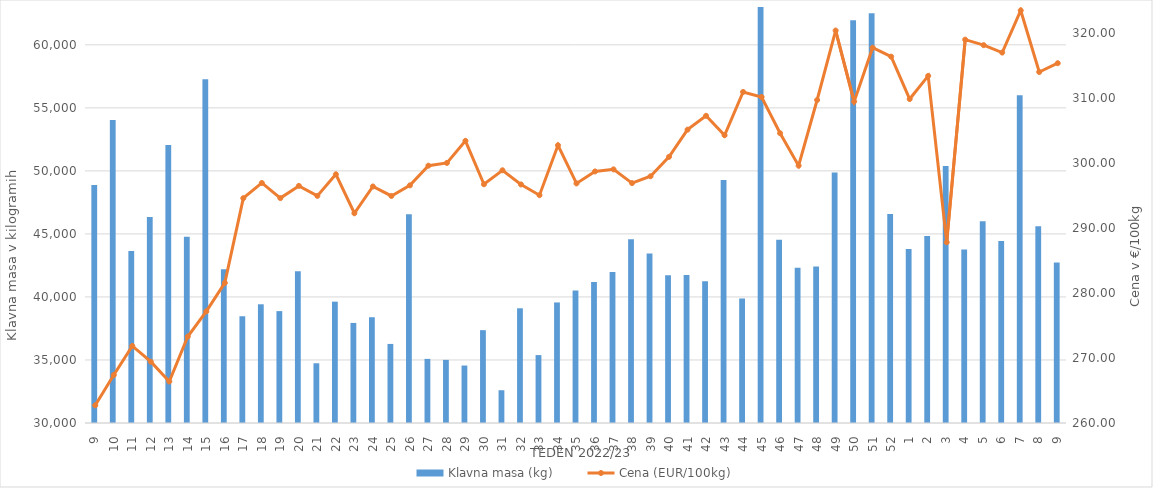
| Category | Klavna masa (kg) |
|---|---|
| 9.0 | 48872 |
| 10.0 | 54045 |
| 11.0 | 43645 |
| 12.0 | 46350 |
| 13.0 | 52061 |
| 14.0 | 44774 |
| 15.0 | 57268 |
| 16.0 | 42191 |
| 17.0 | 38469 |
| 18.0 | 39417 |
| 19.0 | 38876 |
| 20.0 | 42047 |
| 21.0 | 34739 |
| 22.0 | 39626 |
| 23.0 | 37939 |
| 24.0 | 38390 |
| 25.0 | 36272 |
| 26.0 | 46553 |
| 27.0 | 35085 |
| 28.0 | 35007 |
| 29.0 | 34559 |
| 30.0 | 37366 |
| 31.0 | 32599 |
| 32.0 | 39100 |
| 33.0 | 35388 |
| 34.0 | 39563 |
| 35.0 | 40507 |
| 36.0 | 41176 |
| 37.0 | 41983 |
| 38.0 | 44572 |
| 39.0 | 43447 |
| 40.0 | 41711 |
| 41.0 | 41736 |
| 42.0 | 41239 |
| 43.0 | 49284 |
| 44.0 | 39877 |
| 45.0 | 63668 |
| 46.0 | 44528 |
| 47.0 | 42319 |
| 48.0 | 42416 |
| 49.0 | 49873 |
| 50.0 | 61942 |
| 51.0 | 62514 |
| 52.0 | 46589 |
| 1.0 | 43807 |
| 2.0 | 44834 |
| 3.0 | 50386 |
| 4.0 | 43773 |
| 5.0 | 46011 |
| 6.0 | 44439 |
| 7.0 | 56001 |
| 8.0 | 45613 |
| 9.0 | 42730 |